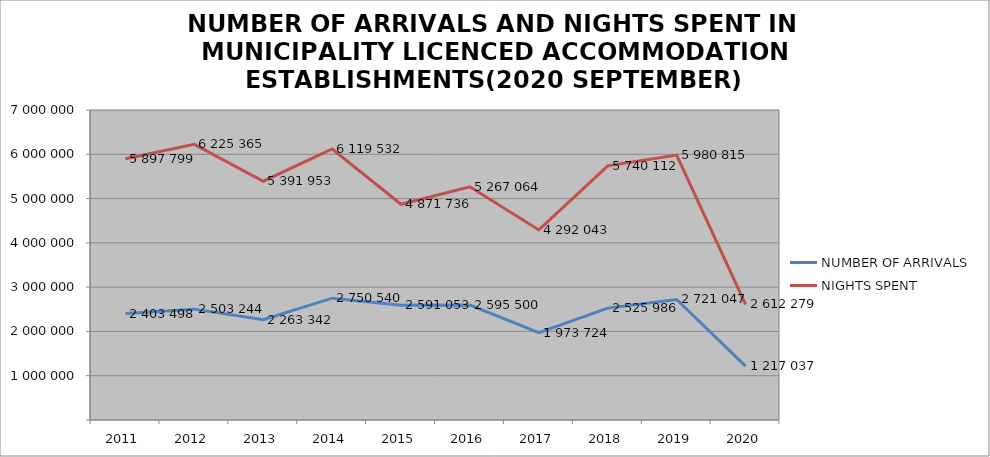
| Category | NUMBER OF ARRIVALS | NIGHTS SPENT |
|---|---|---|
| 2011 | 2403498 | 5897799 |
| 2012 | 2503244 | 6225365 |
| 2013 | 2263342 | 5391953 |
| 2014 | 2750540 | 6119532 |
| 2015 | 2591053 | 4871736 |
| 2016 | 2595500 | 5267064 |
| 2017 | 1973724 | 4292043 |
| 2018 | 2525986 | 5740112 |
| 2019 | 2721047 | 5980815 |
| 2020 | 1217037 | 2612279 |